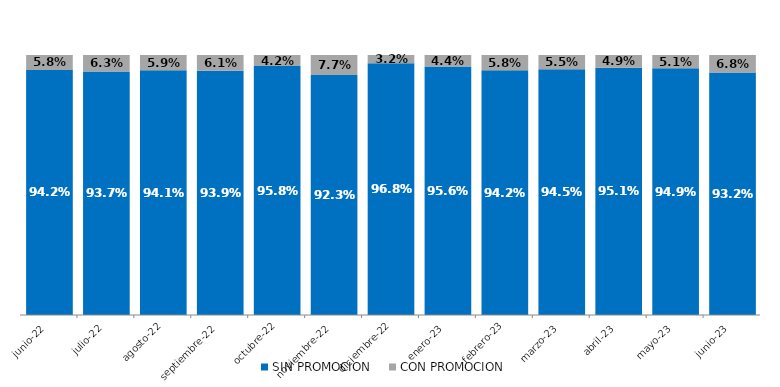
| Category | SIN PROMOCION   | CON PROMOCION   |
|---|---|---|
| 2022-06-01 | 0.942 | 0.058 |
| 2022-07-01 | 0.937 | 0.063 |
| 2022-08-01 | 0.941 | 0.059 |
| 2022-09-01 | 0.939 | 0.061 |
| 2022-10-01 | 0.958 | 0.042 |
| 2022-11-01 | 0.923 | 0.077 |
| 2022-12-01 | 0.968 | 0.032 |
| 2023-01-01 | 0.956 | 0.044 |
| 2023-02-01 | 0.942 | 0.058 |
| 2023-03-01 | 0.945 | 0.055 |
| 2023-04-01 | 0.951 | 0.049 |
| 2023-05-01 | 0.949 | 0.051 |
| 2023-06-01 | 0.932 | 0.068 |